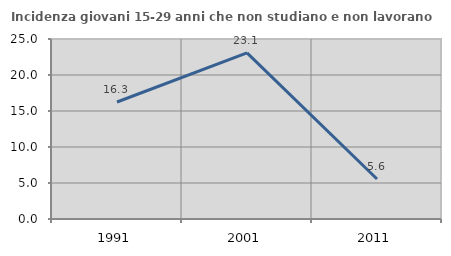
| Category | Incidenza giovani 15-29 anni che non studiano e non lavorano  |
|---|---|
| 1991.0 | 16.25 |
| 2001.0 | 23.077 |
| 2011.0 | 5.556 |